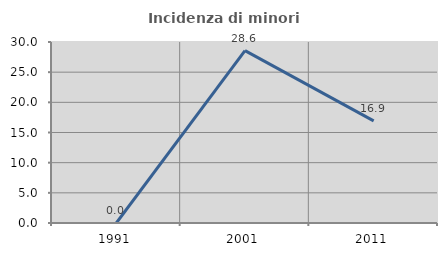
| Category | Incidenza di minori stranieri |
|---|---|
| 1991.0 | 0 |
| 2001.0 | 28.571 |
| 2011.0 | 16.923 |